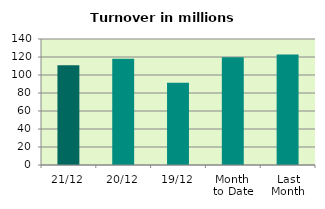
| Category | Series 0 |
|---|---|
| 21/12 | 110.823 |
| 20/12 | 118.033 |
| 19/12 | 91.31 |
| Month 
to Date | 119.691 |
| Last
Month | 122.873 |